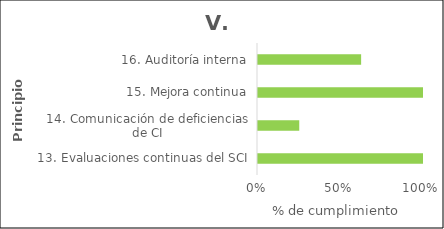
| Category | Principios |
|---|---|
| 13. Evaluaciones continuas del SCI | 1 |
| 14. Comunicación de deficiencias de CI | 0.25 |
| 15. Mejora continua | 1 |
| 16. Auditoría interna | 0.625 |